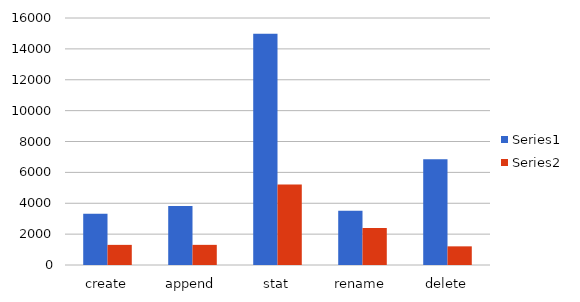
| Category | Series 0 | Series 1 |
|---|---|---|
| create | 3314 | 1304 |
| append | 3814 | 1305 |
| stat | 14978 | 5220 |
| rename | 3510 | 2404 |
| delete | 6849 | 1208 |